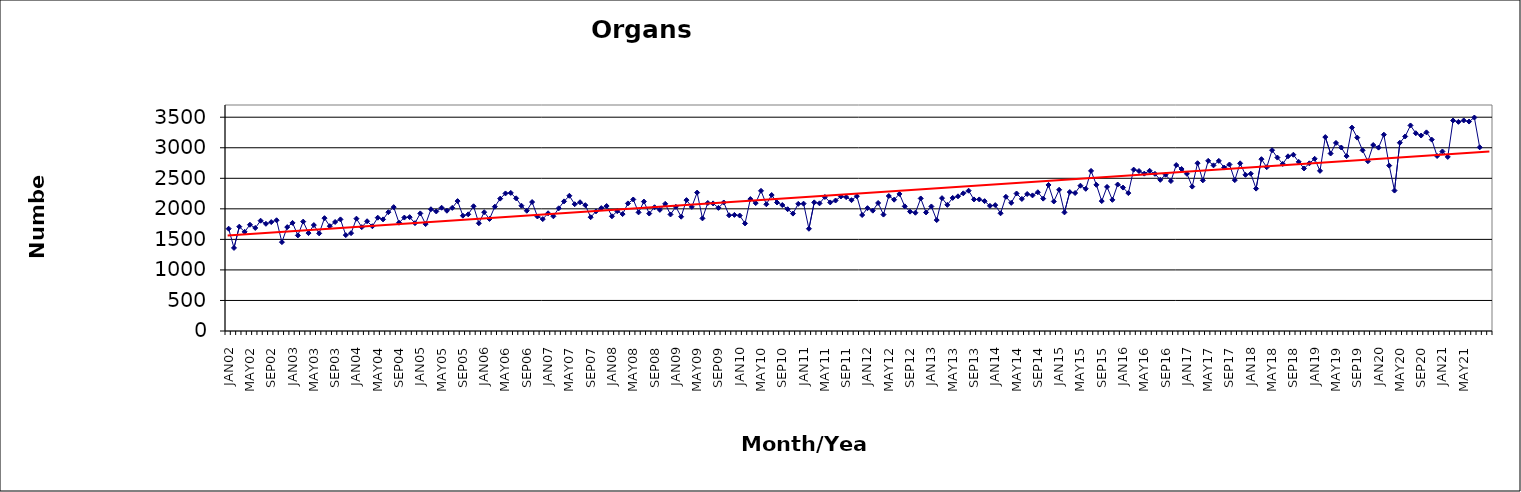
| Category | Series 0 |
|---|---|
| JAN02 | 1675 |
| FEB02 | 1360 |
| MAR02 | 1708 |
| APR02 | 1623 |
| MAY02 | 1740 |
| JUN02 | 1687 |
| JUL02 | 1806 |
| AUG02 | 1755 |
| SEP02 | 1783 |
| OCT02 | 1813 |
| NOV02 | 1455 |
| DEC02 | 1701 |
| JAN03 | 1770 |
| FEB03 | 1565 |
| MAR03 | 1791 |
| APR03 | 1603 |
| MAY03 | 1734 |
| JUN03 | 1598 |
| JUL03 | 1847 |
| AUG03 | 1716 |
| SEP03 | 1785 |
| OCT03 | 1827 |
| NOV03 | 1570 |
| DEC03 | 1602 |
| JAN04 | 1839 |
| FEB04 | 1700 |
| MAR04 | 1797 |
| APR04 | 1715 |
| MAY04 | 1855 |
| JUN04 | 1827 |
| JUL04 | 1945 |
| AUG04 | 2028 |
| SEP04 | 1773 |
| OCT04 | 1857 |
| NOV04 | 1864 |
| DEC04 | 1766 |
| JAN05 | 1925 |
| FEB05 | 1750 |
| MAR05 | 1993 |
| APR05 | 1957 |
| MAY05 | 2018 |
| JUN05 | 1969 |
| JUL05 | 2016 |
| AUG05 | 2127 |
| SEP05 | 1888 |
| OCT05 | 1910 |
| NOV05 | 2042 |
| DEC05 | 1764 |
| JAN06 | 1945 |
| FEB06 | 1834 |
| MAR06 | 2035 |
| APR06 | 2167 |
| MAY06 | 2252 |
| JUN06 | 2261 |
| JUL06 | 2172 |
| AUG06 | 2051 |
| SEP06 | 1969 |
| OCT06 | 2111 |
| NOV06 | 1875 |
| DEC06 | 1832 |
| JAN07 | 1927 |
| FEB07 | 1878 |
| MAR07 | 2009 |
| APR07 | 2122 |
| MAY07 | 2214 |
| JUN07 | 2076 |
| JUL07 | 2108 |
| AUG07 | 2060 |
| SEP07 | 1863 |
| OCT07 | 1959 |
| NOV07 | 2012 |
| DEC07 | 2046 |
| JAN08 | 1878 |
| FEB08 | 1962 |
| MAR08 | 1914 |
| APR08 | 2089 |
| MAY08 | 2153 |
| JUN08 | 1942 |
| JUL08 | 2119 |
| AUG08 | 1923 |
| SEP08 | 2026 |
| OCT08 | 1983 |
| NOV08 | 2082 |
| DEC08 | 1908 |
| JAN09 | 2033 |
| FEB09 | 1871 |
| MAR09 | 2143 |
| APR09 | 2032 |
| MAY09 | 2266 |
| JUN09 | 1844 |
| JUL09 | 2096 |
| AUG09 | 2089 |
| SEP09 | 2016 |
| OCT09 | 2104 |
| NOV09 | 1894 |
| DEC09 | 1901 |
| JAN10 | 1890 |
| FEB10 | 1761 |
| MAR10 | 2160 |
| APR10 | 2094 |
| MAY10 | 2295 |
| JUN10 | 2075 |
| JUL10 | 2226 |
| AUG10 | 2104 |
| SEP10 | 2062 |
| OCT10 | 1994 |
| NOV10 | 1922 |
| DEC10 | 2082 |
| JAN11 | 2085 |
| FEB11 | 1674 |
| MAR11 | 2106 |
| APR11 | 2090 |
| MAY11 | 2194 |
| JUN11 | 2105 |
| JUL11 | 2136 |
| AUG11 | 2202 |
| SEP11 | 2192 |
| OCT11 | 2142 |
| NOV11 | 2207 |
| DEC11 | 1899 |
| JAN12 | 2011 |
| FEB12 | 1970 |
| MAR12 | 2096 |
| APR12 | 1906 |
| MAY12 | 2210 |
| JUN12 | 2150 |
| JUL12 | 2244 |
| AUG12 | 2041 |
| SEP12 | 1954 |
| OCT12 | 1936 |
| NOV12 | 2170 |
| DEC12 | 1941 |
| JAN13 | 2039 |
| FEB13 | 1816 |
| MAR13 | 2175 |
| APR13 | 2065 |
| MAY13 | 2179 |
| JUN13 | 2205 |
| JUL13 | 2254 |
| AUG13 | 2297 |
| SEP13 | 2154 |
| OCT13 | 2154 |
| NOV13 | 2126 |
| DEC13 | 2049 |
| JAN14 | 2061 |
| FEB14 | 1927 |
| MAR14 | 2197 |
| APR14 | 2098 |
| MAY14 | 2251 |
| JUN14 | 2162 |
| JUL14 | 2243 |
| AUG14 | 2220 |
| SEP14 | 2272 |
| OCT14 | 2167 |
| NOV14 | 2391 |
| DEC14 | 2121 |
| JAN15 | 2312 |
| FEB15 | 1942 |
| MAR15 | 2275 |
| APR15 | 2259 |
| MAY15 | 2379 |
| JUN15 | 2328 |
| JUL15 | 2621 |
| AUG15 | 2393 |
| SEP15 | 2127 |
| OCT15 | 2359 |
| NOV15 | 2147 |
| DEC15 | 2398 |
| JAN16 | 2348 |
| FEB16 | 2258 |
| MAR16 | 2642 |
| APR16 | 2619 |
| MAY16 | 2576 |
| JUN16 | 2623 |
| JUL16 | 2573 |
| AUG16 | 2475 |
| SEP16 | 2559 |
| OCT16 | 2455 |
| NOV16 | 2717 |
| DEC16 | 2652 |
| JAN17 | 2574 |
| FEB17 | 2364 |
| MAR17 | 2747 |
| APR17 | 2466 |
| MAY17 | 2786 |
| JUN17 | 2712 |
| JUL17 | 2785 |
| AUG17 | 2676 |
| SEP17 | 2726 |
| OCT17 | 2470 |
| NOV17 | 2745 |
| DEC17 | 2557 |
| JAN18 | 2575 |
| FEB18 | 2331 |
| MAR18 | 2813 |
| APR18 | 2681 |
| MAY18 | 2960 |
| JUN18 | 2839 |
| JUL18 | 2735 |
| AUG18 | 2860 |
| SEP18 | 2886 |
| OCT18 | 2769 |
| NOV18 | 2661 |
| DEC18 | 2745 |
| JAN19 | 2819 |
| FEB19 | 2622 |
| MAR19 | 3175 |
| APR19 | 2906 |
| MAY19 | 3079 |
| JUN19 | 3004 |
| JUL19 | 2863 |
| AUG19 | 3330 |
| SEP19 | 3166 |
| OCT19 | 2958 |
| NOV19 | 2779 |
| DEC19 | 3045 |
| JAN20 | 3002 |
| FEB20 | 3214 |
| MAR20 | 2708 |
| APR20 | 2299 |
| MAY20 | 3082 |
| JUN20 | 3185 |
| JUL20 | 3365 |
| AUG20 | 3238 |
| SEP20 | 3200 |
| OCT20 | 3252 |
| NOV20 | 3133 |
| DEC20 | 2865 |
| JAN21 | 2939 |
| FEB21 | 2850 |
| MAR21 | 3446 |
| APR21 | 3424 |
| MAY21 | 3447 |
| JUN21 | 3429 |
| JUL21 | 3495 |
| AUG21 | 3007 |